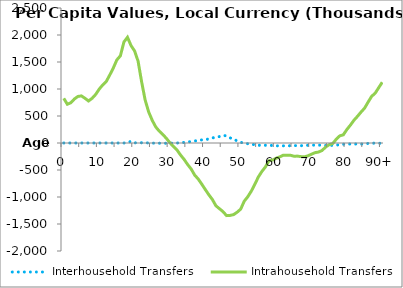
| Category | Interhousehold Transfers | Intrahousehold Transfers |
|---|---|---|
| 0 | 0 | 827219.091 |
|  | 0 | 717622.594 |
| 2 | 0 | 745146.262 |
| 3 | 0 | 815200.626 |
| 4 | 0 | 862192.798 |
| 5 | 0 | 872118.874 |
| 6 | 0 | 828054.936 |
| 7 | 0 | 777860.551 |
| 8 | 0 | 826885.591 |
| 9 | 0 | 898584.385 |
| 10 | 0 | 996393.827 |
| 11 | 0 | 1075064.393 |
| 12 | 0 | 1138079.403 |
| 13 | 0 | 1259800.192 |
| 14 | 0 | 1389021.705 |
| 15 | 0 | 1538645.946 |
| 16 | 0 | 1615219.515 |
| 17 | 0 | 1870752.507 |
| 18 | 4616.011 | 1957862.859 |
| 19 | 31737.565 | 1805232.375 |
| 20 | 62.093 | 1706968.112 |
| 21 | 9656.85 | 1515511.596 |
| 22 | 3985.572 | 1133748.061 |
| 23 | 3176.684 | 795597.797 |
| 24 | 822.166 | 573531.327 |
| 25 | -2522.843 | 420182.784 |
| 26 | -1955.732 | 296749.081 |
| 27 | -3483.271 | 218636.053 |
| 28 | -3859.612 | 157079.805 |
| 29 | -4945.681 | 85384.227 |
| 30 | -4544.078 | 3981.563 |
| 31 | -2778.041 | -63160.442 |
| 32 | -872.686 | -129364.041 |
| 33 | 5689.277 | -222410.16 |
| 34 | 9744.811 | -303153.167 |
| 35 | 21070.588 | -398178.305 |
| 36 | 25186.036 | -481250.439 |
| 37 | 37336.774 | -594301.23 |
| 38 | 46780.58 | -667400.051 |
| 39 | 58265.98 | -761973.229 |
| 40 | 58992.932 | -862792.619 |
| 41 | 77249.168 | -958571.056 |
| 42 | 94305.028 | -1046362.564 |
| 43 | 107068.433 | -1163106.997 |
| 44 | 118852.3 | -1216781.709 |
| 45 | 141133.018 | -1270725.019 |
| 46 | 132655.428 | -1344647.389 |
| 47 | 95010.147 | -1341068.266 |
| 48 | 72409.664 | -1325997.845 |
| 49 | 38162.187 | -1281497.058 |
| 50 | 12547.393 | -1223998.127 |
| 51 | -5336.302 | -1078147.788 |
| 52 | -13114.745 | -995314.657 |
| 53 | -29353.396 | -891201.41 |
| 54 | -27890.832 | -763997.597 |
| 55 | -41309.245 | -627474.576 |
| 56 | -46876.067 | -526194.671 |
| 57 | -42528.118 | -442024.928 |
| 58 | -42070.453 | -327285.773 |
| 59 | -47601.937 | -315190.45 |
| 60 | -52025.995 | -281987.25 |
| 61 | -53267.465 | -258238.526 |
| 62 | -52661.254 | -227031.332 |
| 63 | -51657.725 | -226789.051 |
| 64 | -50901.51 | -226210.717 |
| 65 | -48638.196 | -243643.021 |
| 66 | -48746.364 | -242923.172 |
| 67 | -50181.001 | -252078.116 |
| 68 | -46487.3 | -256040.396 |
| 69 | -42214.824 | -238171.501 |
| 70 | -40678.028 | -207584.142 |
| 71 | -39642.215 | -179102.978 |
| 72 | -38258.844 | -167508.069 |
| 73 | -44211.627 | -138701.965 |
| 74 | -45936.993 | -75332.727 |
| 75 | -45138.139 | -30917.861 |
| 76 | -43939.081 | -11136.335 |
| 77 | -38209.957 | 69000.894 |
| 78 | -33154.494 | 132114.569 |
| 79 | -22657.964 | 151705.275 |
| 80 | -18790.87 | 249814.833 |
| 81 | -19178.113 | 330415.065 |
| 82 | -19197.27 | 420829.754 |
| 83 | -17751.261 | 493393.588 |
| 84 | -19570.831 | 572209.469 |
| 85 | -14992.991 | 644098.156 |
| 86 | -7843.462 | 756225.198 |
| 87 | -5022.965 | 863501.288 |
| 88 | -1333.644 | 922137.098 |
| 89 | -4189.232 | 1023720.954 |
| 90+ | -7044.821 | 1125304.811 |